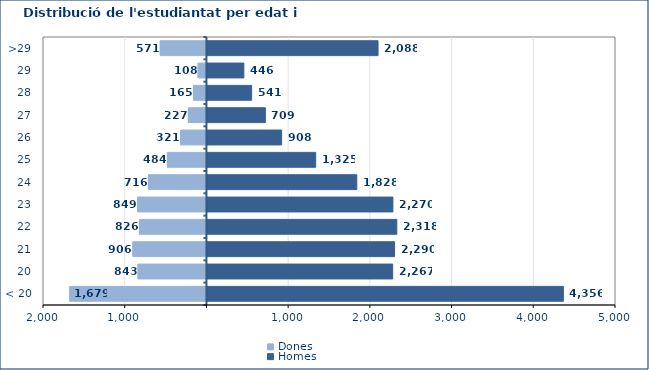
| Category | Dones | Homes |
|---|---|---|
| < 20 | -1679 | 4356 |
| 20 | -843 | 2267 |
| 21 | -906 | 2290 |
| 22 | -826 | 2318 |
| 23 | -849 | 2270 |
| 24 | -716 | 1828 |
| 25 | -484 | 1325 |
| 26 | -321 | 908 |
| 27 | -227 | 709 |
| 28 | -165 | 541 |
| 29 | -108 | 446 |
| >29 | -571 | 2088 |